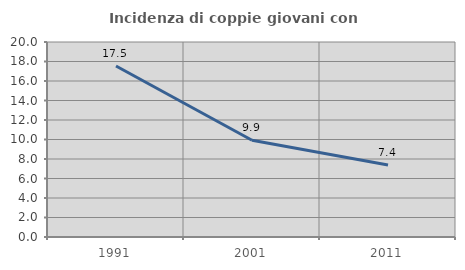
| Category | Incidenza di coppie giovani con figli |
|---|---|
| 1991.0 | 17.543 |
| 2001.0 | 9.925 |
| 2011.0 | 7.387 |